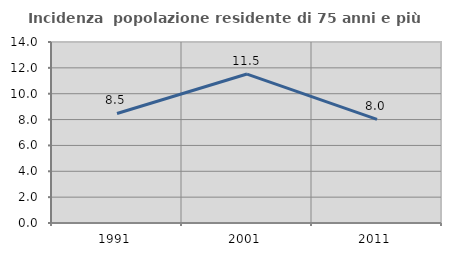
| Category | Incidenza  popolazione residente di 75 anni e più |
|---|---|
| 1991.0 | 8.473 |
| 2001.0 | 11.521 |
| 2011.0 | 8.014 |